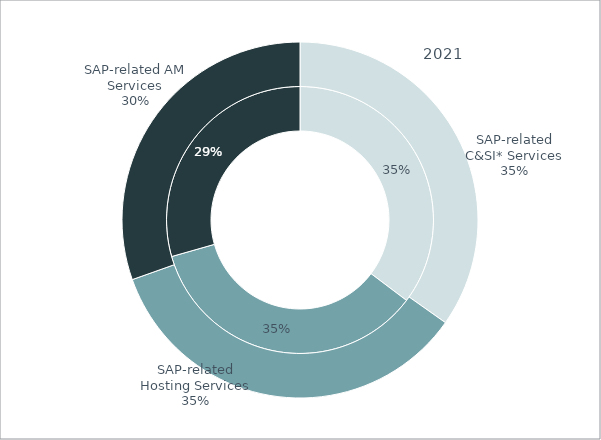
| Category | 2017 | 2021 |
|---|---|---|
| SAP-related C&SI* Services | 120 | 160 |
| SAP-related Hosting Services | 120 | 160 |
| SAP-related AM Services | 100 | 140 |